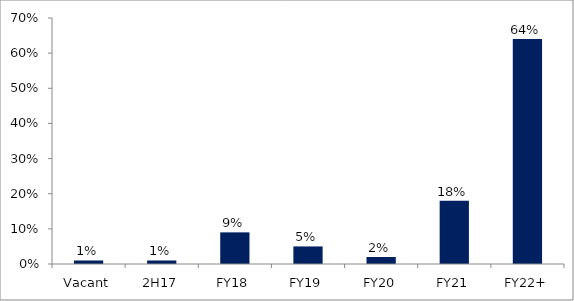
| Category | Series 0 |
|---|---|
| Vacant | 0.01 |
| 2H17 | 0.01 |
| FY18 | 0.09 |
| FY19 | 0.05 |
| FY20 | 0.02 |
| FY21 | 0.18 |
| FY22+ | 0.64 |